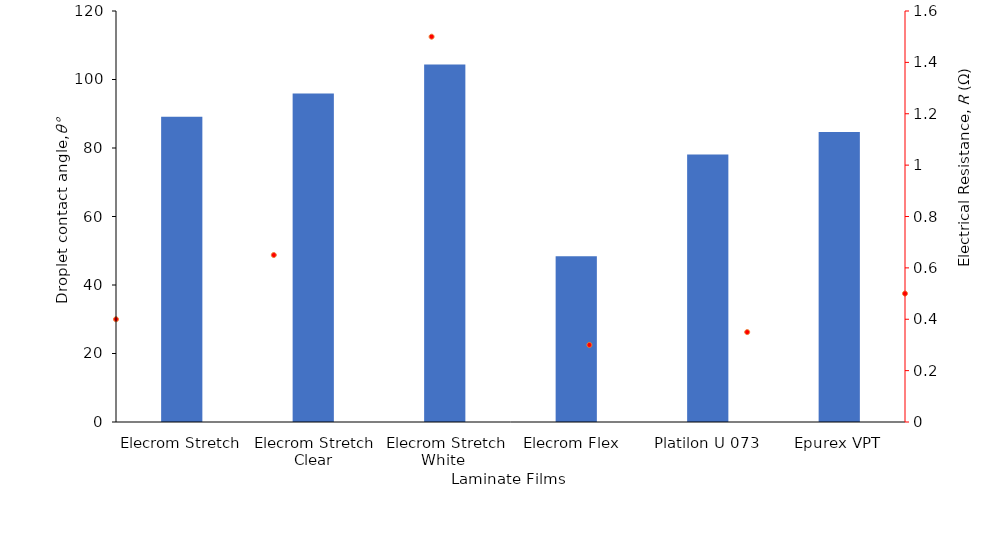
| Category | Contact angle |
|---|---|
| Elecrom Stretch | 89.1 |
| Elecrom Stretch Clear | 95.9 |
| Elecrom Stretch White  | 104.4 |
| Elecrom Flex  | 48.4 |
| Platilon U 073 | 78.1 |
| Epurex VPT | 84.7 |